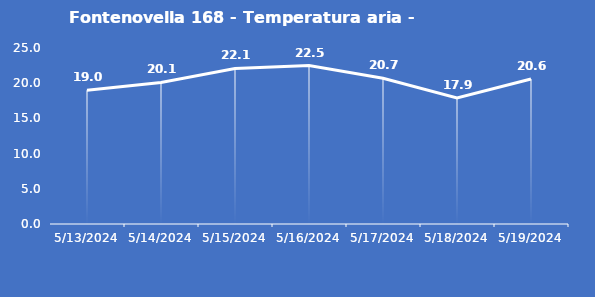
| Category | Fontenovella 168 - Temperatura aria - Grezzo (°C) |
|---|---|
| 5/13/24 | 19 |
| 5/14/24 | 20.1 |
| 5/15/24 | 22.1 |
| 5/16/24 | 22.5 |
| 5/17/24 | 20.7 |
| 5/18/24 | 17.9 |
| 5/19/24 | 20.6 |